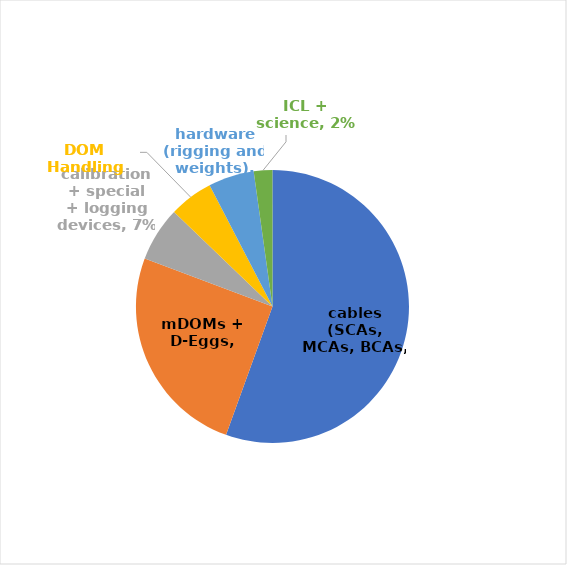
| Category | Series 0 |
|---|---|
| cables (SCAs, MCAs, BCAs, SJBs) | 128114 |
| mDOMs + D-Eggs | 58149 |
| calibration + special
+ logging devices | 14878 |
| DOM Handling Facility | 12000 |
| hardware (rigging and weights) | 12502 |
| ICL + science | 5075 |
| Logistics equipment total | 10 |